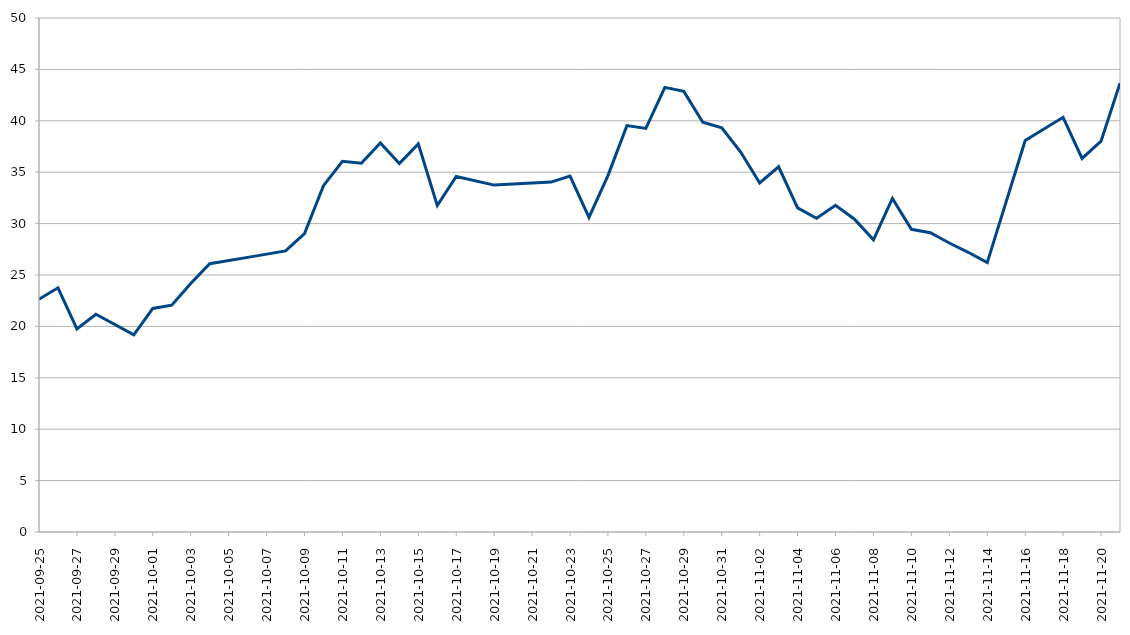
| Category | Bank |
|---|---|
| 2021-09-25 | 22.646 |
| 2021-09-26 | 23.753 |
| 2021-09-27 | 19.753 |
| 2021-09-28 | 21.183 |
| 2021-09-30 | 19.183 |
| 2021-10-01 | 21.75 |
| 2021-10-02 | 22.063 |
| 2021-10-03 | 24.178 |
| 2021-10-04 | 26.098 |
| 2021-10-06 | 26.715 |
| 2021-10-08 | 27.342 |
| 2021-10-09 | 29.036 |
| 2021-10-10 | 33.691 |
| 2021-10-11 | 36.062 |
| 2021-10-12 | 35.866 |
| 2021-10-13 | 37.844 |
| 2021-10-14 | 35.844 |
| 2021-10-15 | 37.755 |
| 2021-10-16 | 31.755 |
| 2021-10-17 | 34.587 |
| 2021-10-19 | 33.744 |
| 2021-10-22 | 34.037 |
| 2021-10-23 | 34.614 |
| 2021-10-24 | 30.614 |
| 2021-10-25 | 34.671 |
| 2021-10-26 | 39.531 |
| 2021-10-27 | 39.256 |
| 2021-10-28 | 43.254 |
| 2021-10-29 | 42.861 |
| 2021-10-30 | 39.861 |
| 2021-10-31 | 39.312 |
| 2021-11-01 | 36.958 |
| 2021-11-02 | 33.958 |
| 2021-11-03 | 35.526 |
| 2021-11-04 | 31.526 |
| 2021-11-05 | 30.526 |
| 2021-11-06 | 31.78 |
| 2021-11-07 | 30.427 |
| 2021-11-08 | 28.427 |
| 2021-11-09 | 32.445 |
| 2021-11-10 | 29.445 |
| 2021-11-11 | 29.111 |
| 2021-11-12 | 28.111 |
| 2021-11-13 | 27.208 |
| 2021-11-14 | 26.208 |
| 2021-11-16 | 38.086 |
| 2021-11-18 | 40.339 |
| 2021-11-19 | 36.339 |
| 2021-11-20 | 38.025 |
| 2021-11-21 | 43.65 |